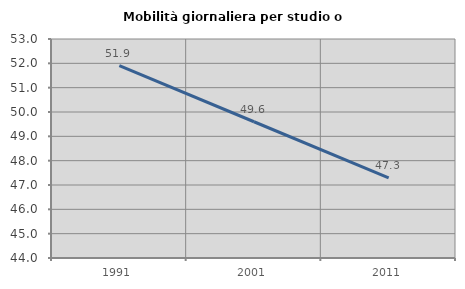
| Category | Mobilità giornaliera per studio o lavoro |
|---|---|
| 1991.0 | 51.904 |
| 2001.0 | 49.599 |
| 2011.0 | 47.297 |